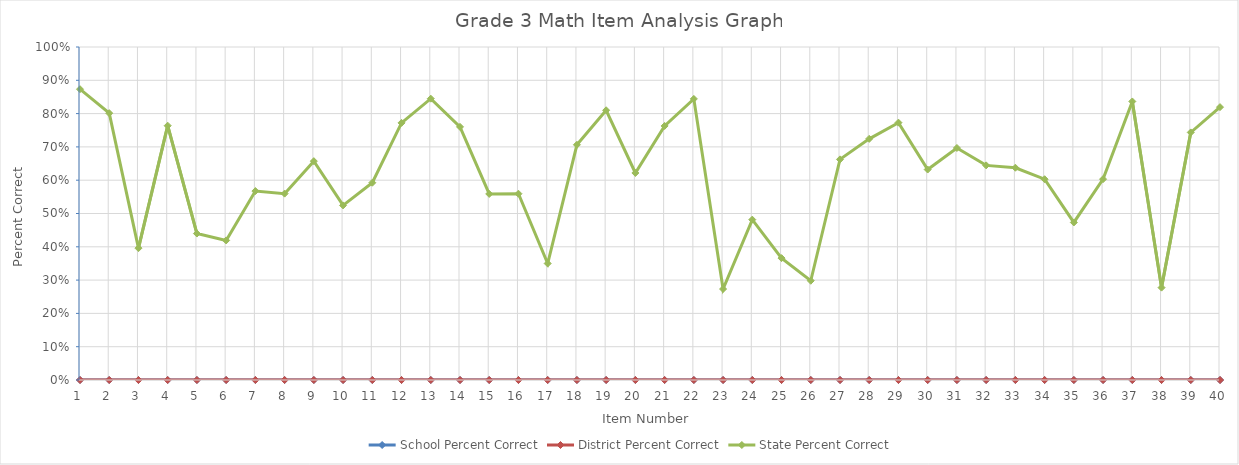
| Category | School Percent Correct | District Percent Correct | State Percent Correct |
|---|---|---|---|
| 1.0 | 0 | 0 | 0.873 |
| 2.0 | 0 | 0 | 0.801 |
| 3.0 | 0 | 0 | 0.396 |
| 4.0 | 0 | 0 | 0.764 |
| 5.0 | 0 | 0 | 0.44 |
| 6.0 | 0 | 0 | 0.419 |
| 7.0 | 0 | 0 | 0.567 |
| 8.0 | 0 | 0 | 0.56 |
| 9.0 | 0 | 0 | 0.657 |
| 10.0 | 0 | 0 | 0.524 |
| 11.0 | 0 | 0 | 0.592 |
| 12.0 | 0 | 0 | 0.772 |
| 13.0 | 0 | 0 | 0.845 |
| 14.0 | 0 | 0 | 0.76 |
| 15.0 | 0 | 0 | 0.559 |
| 16.0 | 0 | 0 | 0.559 |
| 17.0 | 0 | 0 | 0.35 |
| 18.0 | 0 | 0 | 0.706 |
| 19.0 | 0 | 0 | 0.81 |
| 20.0 | 0 | 0 | 0.622 |
| 21.0 | 0 | 0 | 0.763 |
| 22.0 | 0 | 0 | 0.844 |
| 23.0 | 0 | 0 | 0.273 |
| 24.0 | 0 | 0 | 0.482 |
| 25.0 | 0 | 0 | 0.366 |
| 26.0 | 0 | 0 | 0.298 |
| 27.0 | 0 | 0 | 0.663 |
| 28.0 | 0 | 0 | 0.724 |
| 29.0 | 0 | 0 | 0.773 |
| 30.0 | 0 | 0 | 0.632 |
| 31.0 | 0 | 0 | 0.697 |
| 32.0 | 0 | 0 | 0.645 |
| 33.0 | 0 | 0 | 0.637 |
| 34.0 | 0 | 0 | 0.603 |
| 35.0 | 0 | 0 | 0.473 |
| 36.0 | 0 | 0 | 0.603 |
| 37.0 | 0 | 0 | 0.836 |
| 38.0 | 0 | 0 | 0.277 |
| 39.0 | 0 | 0 | 0.743 |
| 40.0 | 0 | 0 | 0.819 |